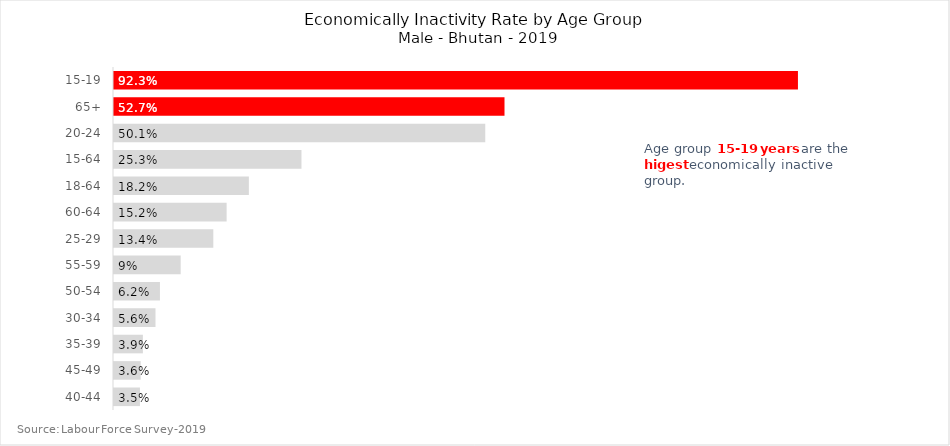
| Category | Series 0 |
|---|---|
| 40-44 | 3.5 |
| 45-49 | 3.6 |
| 35-39 | 3.9 |
| 30-34 | 5.6 |
| 50-54 | 6.2 |
| 55-59 | 9 |
| 25-29 | 13.4 |
| 60-64 | 15.2 |
| 18-64 | 18.2 |
| 15-64 | 25.3 |
| 20-24 | 50.1 |
| 65+ | 52.7 |
| 15-19 | 92.3 |